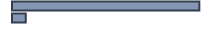
| Category | Series 0 |
|---|---|
| 0 | 93.2 |
| 1 | 6.8 |